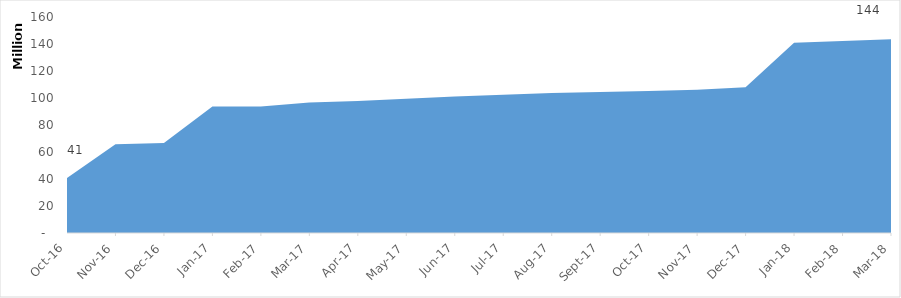
| Category | Series 0 |
|---|---|
| 2016-10-01 | 40669204.09 |
| 2016-11-01 | 65788656.96 |
| 2016-12-01 | 66681805.32 |
| 2017-01-01 | 93795736.12 |
| 2017-02-01 | 93795736.12 |
| 2017-03-01 | 96685230.61 |
| 2017-04-01 | 97797379.82 |
| 2017-05-01 | 99480679.3 |
| 2017-06-01 | 101143313.26 |
| 2017-07-01 | 102367152.3 |
| 2017-08-01 | 103632073.75 |
| 2017-09-01 | 104371757.93 |
| 2017-10-01 | 105251930.6 |
| 2017-11-01 | 106038689.96 |
| 2017-12-01 | 107916485.74 |
| 2018-01-01 | 140899251.52 |
| 2018-02-01 | 142129646.62 |
| 2018-03-01 | 143566075.96 |